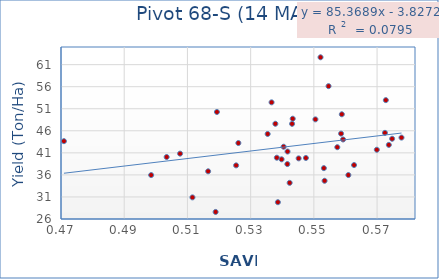
| Category | Series 0 |
|---|---|
| 0.574766 | 44.193 |
| 0.550494 | 48.59 |
| 0.558608 | 45.357 |
| 0.577729 | 44.457 |
| 0.538285 | 39.897 |
| 0.543109 | 47.577 |
| 0.541614 | 38.457 |
| 0.539793 | 39.537 |
| 0.572492 | 45.533 |
| 0.51892 | 27.6 |
| 0.507674 | 40.82 |
| 0.537821 | 47.593 |
| 0.559248 | 44.033 |
| 0.511592 | 30.9 |
| 0.498526 | 36.813 |
| 0.470927 | 35.96 |
| 0.526115 | 43.65 |
| 0.573722 | 43.227 |
| 0.558847 | 42.803 |
| 0.56272 | 49.743 |
| 0.543311 | 38.233 |
| 0.541673 | 48.74 |
| 0.535384 | 41.3 |
| 0.542345 | 45.283 |
| 0.553167 | 34.2 |
| 0.538618 | 40.053 |
| 0.553394 | 37.533 |
| 0.519331 | 29.81 |
| 0.525407 | 34.667 |
| 0.552112 | 50.267 |
| 0.540434 | 38.16 |
| 0.545188 | 39.84 |
| 0.560919 | 62.667 |
| 0.554647 | 42.387 |
| 0.557417 | 39.747 |
| 0.536623 | 35.967 |
| 0.572774 | 56.123 |
| 0.569923 | 42.28 |
| 0.552782 | 52.45 |
| 0.568927 | 52.953 |
| 0.55447 | 41.7 |